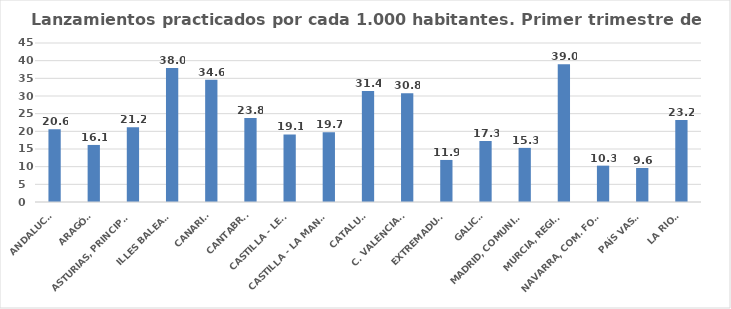
| Category | 616 |
|---|---|
| ANDALUCÍA | 20.591 |
| ARAGÓN | 16.146 |
| ASTURIAS, PRINCIPADO | 21.155 |
| ILLES BALEARS | 37.958 |
| CANARIAS | 34.587 |
| CANTABRIA | 23.789 |
| CASTILLA - LEÓN | 19.107 |
| CASTILLA - LA MANCHA | 19.729 |
| CATALUÑA | 31.417 |
| C. VALENCIANA | 30.756 |
| EXTREMADURA | 11.901 |
| GALICIA | 17.259 |
| MADRID, COMUNIDAD | 15.314 |
| MURCIA, REGIÓN | 39 |
| NAVARRA, COM. FORAL | 10.287 |
| PAÍS VASCO | 9.627 |
| LA RIOJA | 23.181 |